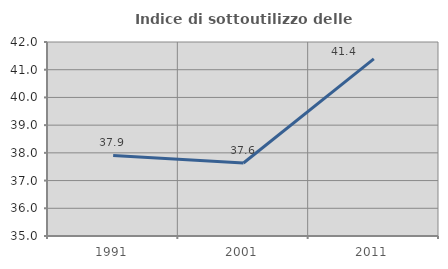
| Category | Indice di sottoutilizzo delle abitazioni  |
|---|---|
| 1991.0 | 37.908 |
| 2001.0 | 37.634 |
| 2011.0 | 41.393 |